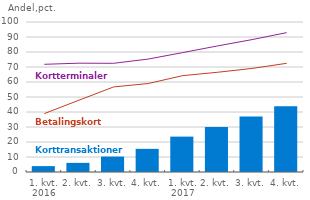
| Category | Korttransaktioner |
|---|---|
| 1. kvt.
2016 | 3.926 |
| 2. kvt. | 6.089 |
| 3. kvt. | 10.281 |
| 4. kvt. | 15.435 |
| 1. kvt.
2017 | 23.592 |
| 2. kvt. | 29.927 |
| 3. kvt. | 36.937 |
| 4. kvt. | 43.878 |